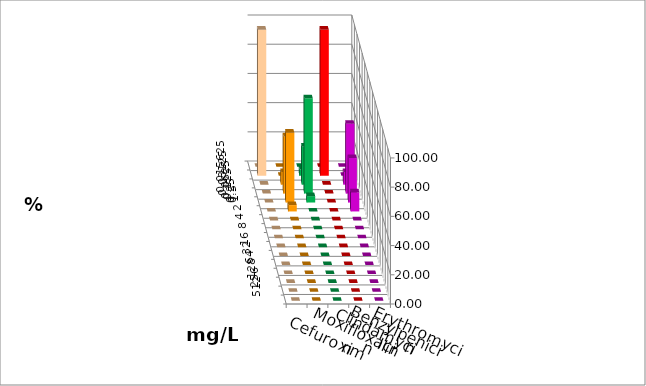
| Category | Cefuroxim | Moxifloxacin | Clindamycin | Benzylpenicillin | Erythromycin |
|---|---|---|---|---|---|
| 0.015625 | 0 | 0 | 0 | 0 | 0 |
| 0.03125 | 100 | 0 | 4.348 | 100 | 0 |
| 0.0625 | 0 | 8.696 | 26.087 | 0 | 8.696 |
| 0.125 | 0 | 39.13 | 65.217 | 0 | 47.826 |
| 0.25 | 0 | 47.826 | 4.348 | 0 | 30.435 |
| 0.5 | 0 | 4.348 | 0 | 0 | 13.043 |
| 1.0 | 0 | 0 | 0 | 0 | 0 |
| 2.0 | 0 | 0 | 0 | 0 | 0 |
| 4.0 | 0 | 0 | 0 | 0 | 0 |
| 8.0 | 0 | 0 | 0 | 0 | 0 |
| 16.0 | 0 | 0 | 0 | 0 | 0 |
| 32.0 | 0 | 0 | 0 | 0 | 0 |
| 64.0 | 0 | 0 | 0 | 0 | 0 |
| 128.0 | 0 | 0 | 0 | 0 | 0 |
| 256.0 | 0 | 0 | 0 | 0 | 0 |
| 512.0 | 0 | 0 | 0 | 0 | 0 |